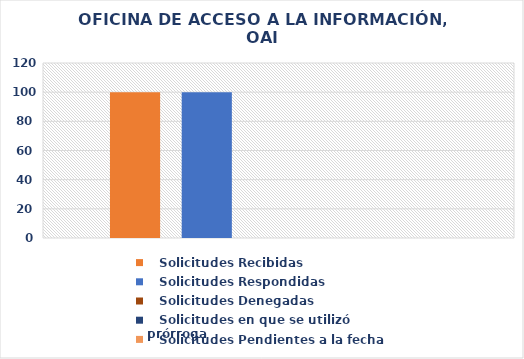
| Category |    Solicitudes Recibidas |    Solicitudes Respondidas |    Solicitudes Denegadas |    Solicitudes en que se utilizó prórroga |    Solicitudes Pendientes a la fecha |
|---|---|---|---|---|---|
| 0 | 100 | 100 | 0 | 0 | 0 |